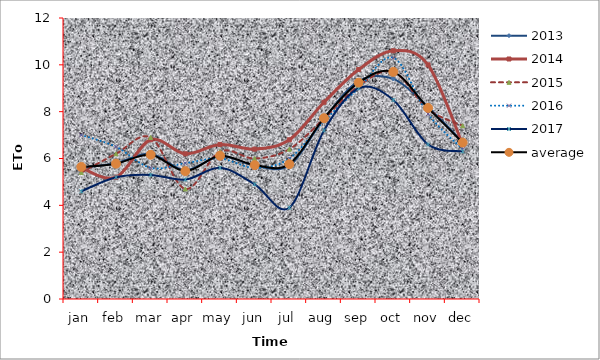
| Category | 2013 | 2014 | 2015 | 2016 | 2017 | average |
|---|---|---|---|---|---|---|
| jan | 5.6 | 5.6 | 5.4 | 7 | 4.6 | 5.64 |
| feb | 5.8 | 5.2 | 6.2 | 6.5 | 5.2 | 5.78 |
| mar | 6.2 | 6.8 | 6.9 | 5.6 | 5.3 | 6.16 |
| apr | 5.5 | 6.2 | 4.7 | 5.8 | 5.1 | 5.46 |
| may | 6.1 | 6.6 | 6.3 | 6 | 5.6 | 6.12 |
| jun | 5.7 | 6.4 | 6 | 5.6 | 4.9 | 5.72 |
| jul | 5.7 | 6.8 | 6.4 | 6 | 3.9 | 5.76 |
| aug | 7.7 | 8.4 | 7.7 | 7.6 | 7.2 | 7.72 |
| sep | 9.3 | 9.8 | 9.1 | 9 | 9 | 9.24 |
| oct | 9.4 | 10.6 | 9.7 | 10.3 | 8.5 | 9.7 |
| nov | 8.2 | 10 | 8.1 | 7.9 | 6.6 | 8.16 |
| dec | 6.7 | 6.6 | 7.4 | 6.4 | 6.3 | 6.68 |